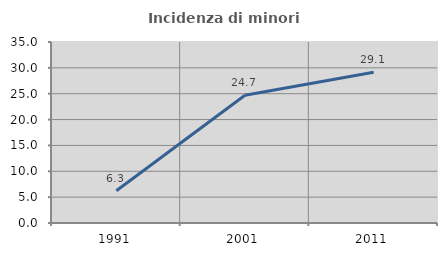
| Category | Incidenza di minori stranieri |
|---|---|
| 1991.0 | 6.25 |
| 2001.0 | 24.706 |
| 2011.0 | 29.134 |